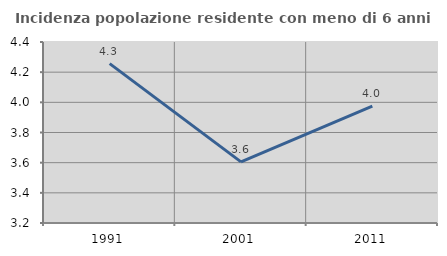
| Category | Incidenza popolazione residente con meno di 6 anni |
|---|---|
| 1991.0 | 4.257 |
| 2001.0 | 3.605 |
| 2011.0 | 3.975 |